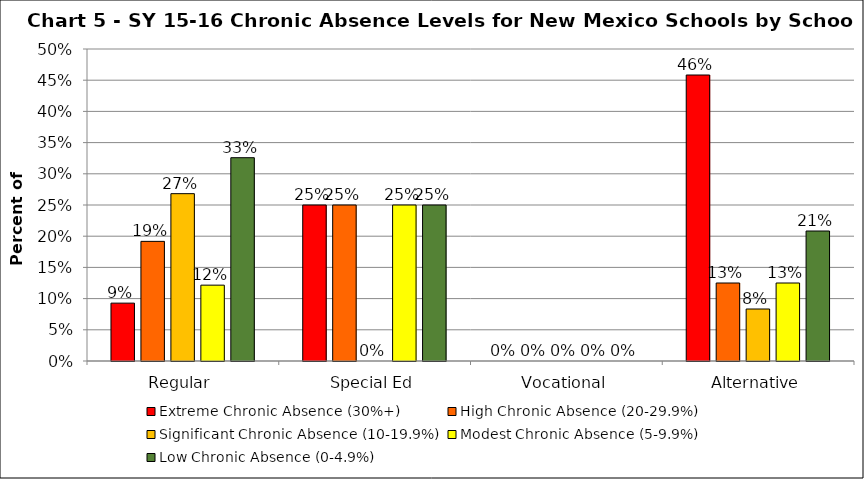
| Category | Extreme Chronic Absence (30%+) | High Chronic Absence (20-29.9%) | Significant Chronic Absence (10-19.9%) | Modest Chronic Absence (5-9.9%) | Low Chronic Absence (0-4.9%) |
|---|---|---|---|---|---|
| 0 | 0.093 | 0.192 | 0.268 | 0.122 | 0.326 |
| 1 | 0.25 | 0.25 | 0 | 0.25 | 0.25 |
| 2 | 0 | 0 | 0 | 0 | 0 |
| 3 | 0.458 | 0.125 | 0.083 | 0.125 | 0.208 |